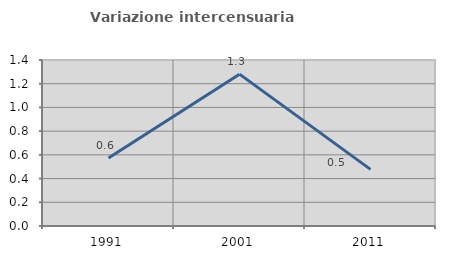
| Category | Variazione intercensuaria annua |
|---|---|
| 1991.0 | 0.573 |
| 2001.0 | 1.281 |
| 2011.0 | 0.478 |